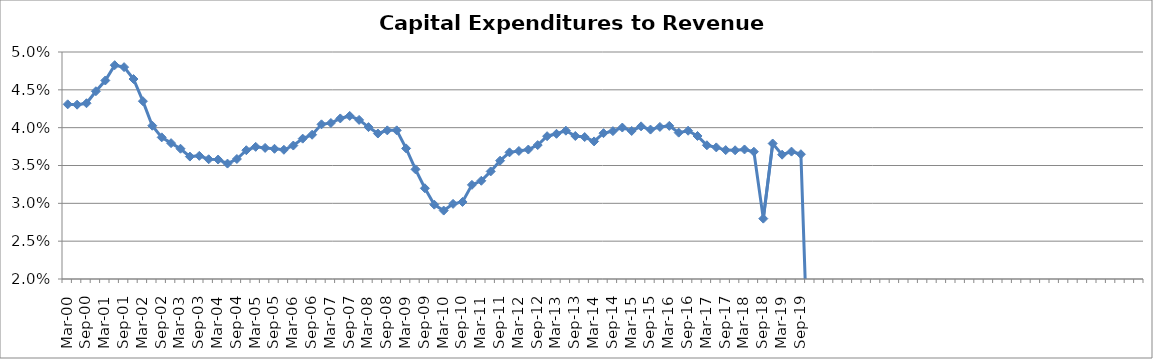
| Category | Series 0 |
|---|---|
| Mar-00 | 0.043 |
| Jun-00 | 0.043 |
| Sep-00 | 0.043 |
| Dec-00 | 0.045 |
| Mar-01 | 0.046 |
| Jun-01 | 0.048 |
| Sep-01 | 0.048 |
| Dec-01 | 0.046 |
| Mar-02 | 0.044 |
| Jun-02 | 0.04 |
| Sep-02 | 0.039 |
| Dec-02 | 0.038 |
| Mar-03 | 0.037 |
| Jun-03 | 0.036 |
| Sep-03 | 0.036 |
| Dec-03 | 0.036 |
| Mar-04 | 0.036 |
| Jun-04 | 0.035 |
| Sep-04 | 0.036 |
| Dec-04 | 0.037 |
| Mar-05 | 0.037 |
| Jun-05 | 0.037 |
| Sep-05 | 0.037 |
| Dec-05 | 0.037 |
| Mar-06 | 0.038 |
| Jun-06 | 0.039 |
| Sep-06 | 0.039 |
| Dec-06 | 0.04 |
| Mar-07 | 0.041 |
| Jun-07 | 0.041 |
| Sep-07 | 0.042 |
| Dec-07 | 0.041 |
| Mar-08 | 0.04 |
| Jun-08 | 0.039 |
| Sep-08 | 0.04 |
| Dec-08 | 0.04 |
| Mar-09 | 0.037 |
| Jun-09 | 0.034 |
| Sep-09 | 0.032 |
| Dec-09 | 0.03 |
| Mar-10 | 0.029 |
| Jun-10 | 0.03 |
| Sep-10 | 0.03 |
| Dec-10 | 0.032 |
| Mar-11 | 0.033 |
| Jun-11 | 0.034 |
| Sep-11 | 0.036 |
| Dec-11 | 0.037 |
| Mar-12 | 0.037 |
| Jun-12 | 0.037 |
| Sep-12 | 0.038 |
| Dec-12 | 0.039 |
| Mar-13 | 0.039 |
| Jun-13 | 0.04 |
| Sep-13 | 0.039 |
| Dec-13 | 0.039 |
| Mar-14 | 0.038 |
| Jun-14 | 0.039 |
| Sep-14 | 0.04 |
| Dec-14 | 0.04 |
| Mar-15 | 0.04 |
| Jun-15 | 0.04 |
| Sep-15 | 0.04 |
| Dec-15 | 0.04 |
| Mar-16 | 0.04 |
| Jun-16 | 0.039 |
| Sep-16 | 0.04 |
| Dec-16 | 0.039 |
| Mar-17 | 0.038 |
| Jun-17 | 0.037 |
| Sep-17 | 0.037 |
| Dec-17 | 0.037 |
| Mar-18 | 0.037 |
| Jun-18 | 0.037 |
| Sep-18 | 0.028 |
| Dec-18 | 0.038 |
| Mar-19 | 0.036 |
| Jun-19 | 0.037 |
| Sep-19 | 0.036 |